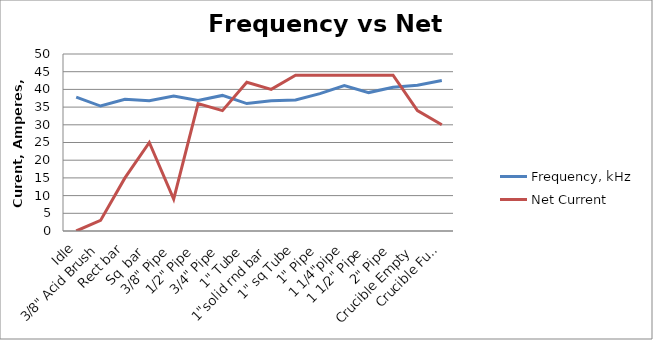
| Category | Frequency, kHz | Net Current |
|---|---|---|
| Idle | 37.8 | 0 |
| 3/8" Acid Brush | 35.3 | 3 |
| Rect bar | 37.2 | 15 |
| Sq  bar | 36.8 | 25 |
| 3/8" Pipe | 38.1 | 9 |
| 1/2" Pipe | 36.9 | 36 |
| 3/4" Pipe | 38.3 | 34 |
| 1" Tube | 36 | 42 |
| 1"solid rnd bar | 36.8 | 40 |
| 1" sq Tube | 37 | 44 |
| 1" Pipe | 38.8 | 44 |
| 1 1/4"pipe | 41.1 | 44 |
| 1 1/2" Pipe | 39.1 | 44 |
| 2" Pipe | 40.6 | 44 |
| Crucible Empty | 41.2 | 34 |
| Crucible Full | 42.5 | 30 |